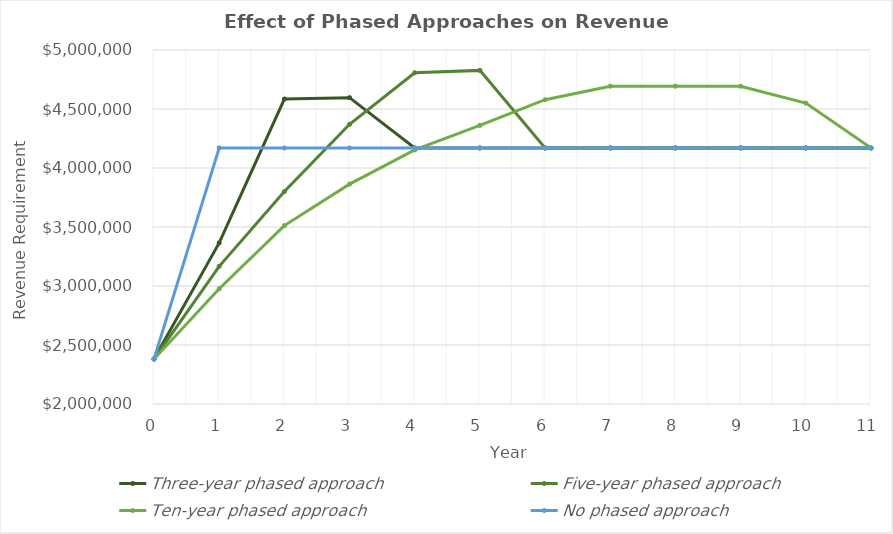
| Category | Three-year phased approach | Five-year phased approach | Ten-year phased approach | No phased approach |
|---|---|---|---|---|
| 0.0 | 2381143.99 | 2381143.99 | 2381143.99 | 2381143.99 |
| 1.0 | 3364980.114 | 3166921.507 | 2976429.988 | 4169936.605 |
| 2.0 | 4584489.709 | 3800305.808 | 3512187.385 | 4169936.605 |
| 3.0 | 4596201.831 | 4370351.679 | 3863406.124 | 4169936.605 |
| 4.0 | 4169936.942 | 4807386.847 | 4153161.583 | 4169936.605 |
| 5.0 | 4169936.942 | 4827199.144 | 4360819.662 | 4169936.605 |
| 6.0 | 4169936.942 | 4169936.942 | 4578860.645 | 4169936.605 |
| 7.0 | 4169936.942 | 4169936.942 | 4693332.161 | 4169936.605 |
| 8.0 | 4169936.942 | 4169936.942 | 4693332.161 | 4169936.605 |
| 9.0 | 4169936.942 | 4169936.942 | 4693332.161 | 4169936.605 |
| 10.0 | 4169936.942 | 4169936.942 | 4550090.969 | 4169936.605 |
| 11.0 | 4169936.942 | 4169936.942 | 4169936.942 | 4169936.605 |